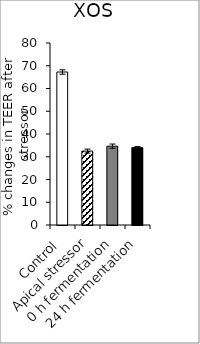
| Category | average |
|---|---|
| Control | 67.251 |
| Apical stressor | 32.475 |
| 0 h fermentation | 34.648 |
| 24 h fermentation | 34.003 |